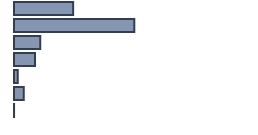
| Category | Percentatge |
|---|---|
| 0 | 24.645 |
| 1 | 50.125 |
| 2 | 10.911 |
| 3 | 8.709 |
| 4 | 1.567 |
| 5 | 4.018 |
| 6 | 0.025 |